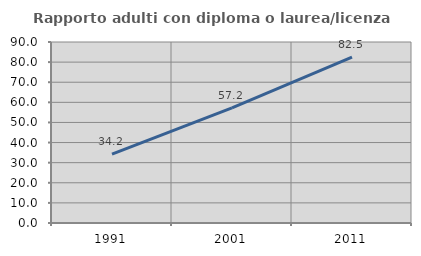
| Category | Rapporto adulti con diploma o laurea/licenza media  |
|---|---|
| 1991.0 | 34.234 |
| 2001.0 | 57.234 |
| 2011.0 | 82.534 |